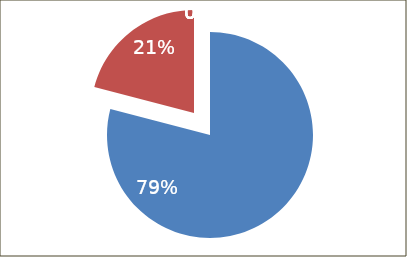
| Category | Series 0 |
|---|---|
| RECURSOS PROPIOS | 15586276 |
| APORTACIONES FEDERALES | 4129752 |
| PROGRAMAS FEDERALES | 0 |
| PROGRAMAS ESTATALES | 0 |
| OTROS | 0 |